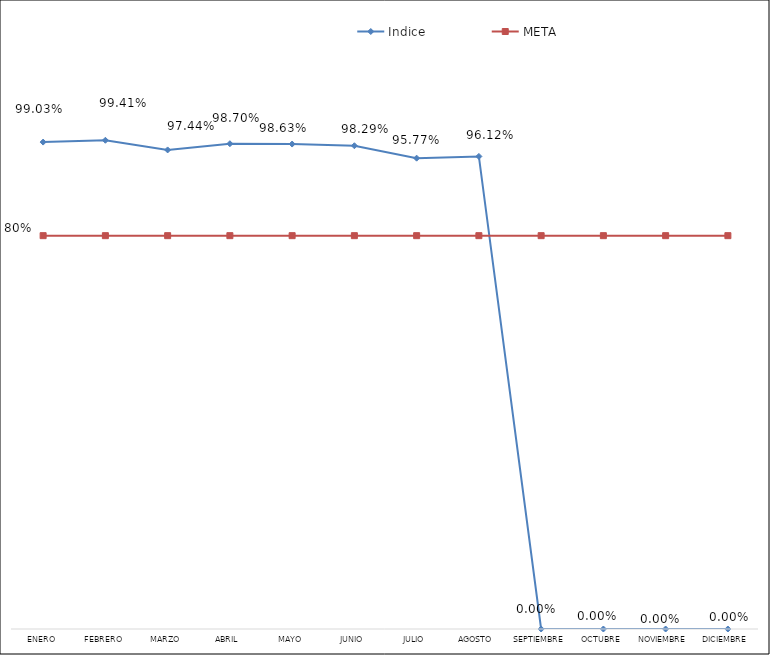
| Category | Indice | META |
|---|---|---|
| Enero | 0.99 | 0.8 |
| Febrero | 0.994 | 0.8 |
| Marzo | 0.974 | 0.8 |
| Abril | 0.987 | 0.8 |
| Mayo | 0.986 | 0.8 |
| Junio | 0.983 | 0.8 |
| Julio | 0.958 | 0.8 |
| Agosto | 0.961 | 0.8 |
| Septiembre | 0 | 0.8 |
| Octubre | 0 | 0.8 |
| Noviembre | 0 | 0.8 |
| Diciembre | 0 | 0.8 |